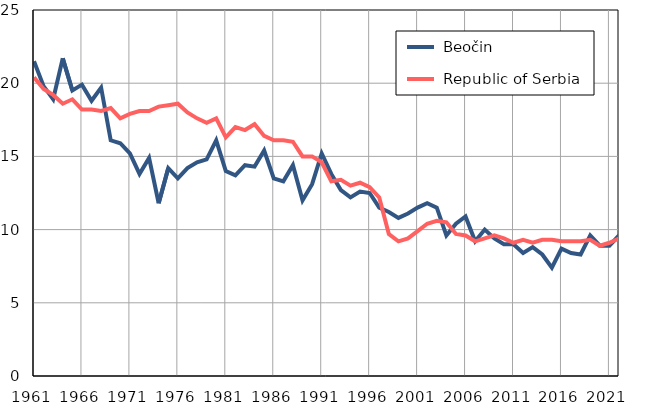
| Category |  Beočin |  Republic of Serbia |
|---|---|---|
| 1961.0 | 21.5 | 20.4 |
| 1962.0 | 19.8 | 19.6 |
| 1963.0 | 18.9 | 19.2 |
| 1964.0 | 21.7 | 18.6 |
| 1965.0 | 19.5 | 18.9 |
| 1966.0 | 19.9 | 18.2 |
| 1967.0 | 18.8 | 18.2 |
| 1968.0 | 19.7 | 18.1 |
| 1969.0 | 16.1 | 18.3 |
| 1970.0 | 15.9 | 17.6 |
| 1971.0 | 15.2 | 17.9 |
| 1972.0 | 13.8 | 18.1 |
| 1973.0 | 14.9 | 18.1 |
| 1974.0 | 11.8 | 18.4 |
| 1975.0 | 14.2 | 18.5 |
| 1976.0 | 13.5 | 18.6 |
| 1977.0 | 14.2 | 18 |
| 1978.0 | 14.6 | 17.6 |
| 1979.0 | 14.8 | 17.3 |
| 1980.0 | 16.1 | 17.6 |
| 1981.0 | 14 | 16.3 |
| 1982.0 | 13.7 | 17 |
| 1983.0 | 14.4 | 16.8 |
| 1984.0 | 14.3 | 17.2 |
| 1985.0 | 15.4 | 16.4 |
| 1986.0 | 13.5 | 16.1 |
| 1987.0 | 13.3 | 16.1 |
| 1988.0 | 14.4 | 16 |
| 1989.0 | 12 | 15 |
| 1990.0 | 13.1 | 15 |
| 1991.0 | 15.2 | 14.6 |
| 1992.0 | 13.8 | 13.3 |
| 1993.0 | 12.7 | 13.4 |
| 1994.0 | 12.2 | 13 |
| 1995.0 | 12.6 | 13.2 |
| 1996.0 | 12.5 | 12.9 |
| 1997.0 | 11.5 | 12.2 |
| 1998.0 | 11.2 | 9.7 |
| 1999.0 | 10.8 | 9.2 |
| 2000.0 | 11.1 | 9.4 |
| 2001.0 | 11.5 | 9.9 |
| 2002.0 | 11.8 | 10.4 |
| 2003.0 | 11.5 | 10.6 |
| 2004.0 | 9.6 | 10.5 |
| 2005.0 | 10.4 | 9.7 |
| 2006.0 | 10.9 | 9.6 |
| 2007.0 | 9.2 | 9.2 |
| 2008.0 | 10 | 9.4 |
| 2009.0 | 9.4 | 9.6 |
| 2010.0 | 9 | 9.4 |
| 2011.0 | 9 | 9.1 |
| 2012.0 | 8.4 | 9.3 |
| 2013.0 | 8.8 | 9.1 |
| 2014.0 | 8.3 | 9.3 |
| 2015.0 | 7.4 | 9.3 |
| 2016.0 | 8.7 | 9.2 |
| 2017.0 | 8.4 | 9.2 |
| 2018.0 | 8.3 | 9.2 |
| 2019.0 | 9.6 | 9.3 |
| 2020.0 | 8.9 | 8.9 |
| 2021.0 | 8.9 | 9.1 |
| 2022.0 | 9.6 | 9.4 |